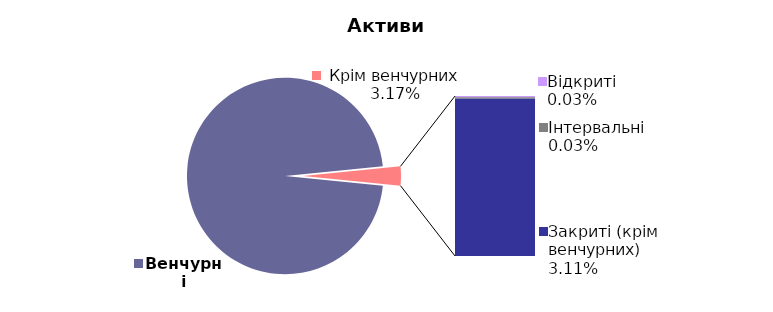
| Category | 30.06.2017 |
|---|---|
| Венчурні | 0.968 |
| Відкриті | 0 |
| Інтервальні | 0 |
| Закриті (крім венчурних) | 0.031 |